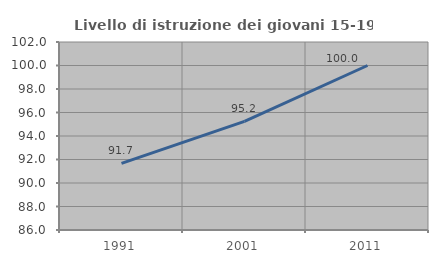
| Category | Livello di istruzione dei giovani 15-19 anni |
|---|---|
| 1991.0 | 91.667 |
| 2001.0 | 95.238 |
| 2011.0 | 100 |